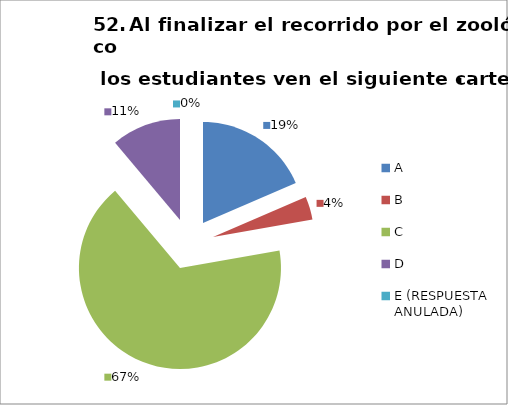
| Category | CANTIDAD DE RESPUESTAS PREGUNTA (52) | PORCENTAJE |
|---|---|---|
| A | 5 | 0.185 |
| B | 1 | 0.037 |
| C | 18 | 0.667 |
| D | 3 | 0.111 |
| E (RESPUESTA ANULADA) | 0 | 0 |